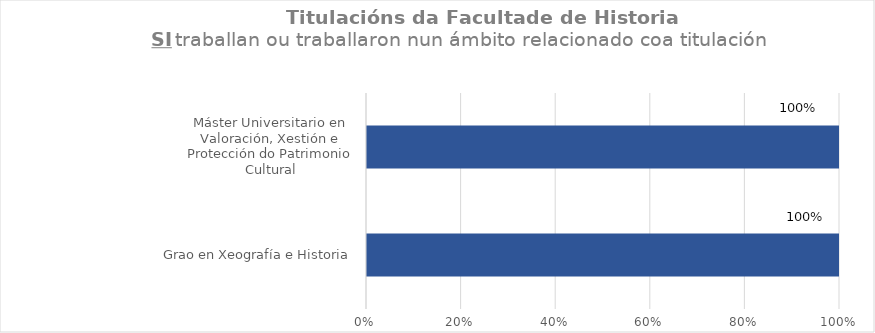
| Category | Series 1 |
|---|---|
| Grao en Xeografía e Historia | 1 |
| Máster Universitario en Valoración, Xestión e Protección do Patrimonio Cultural | 1 |